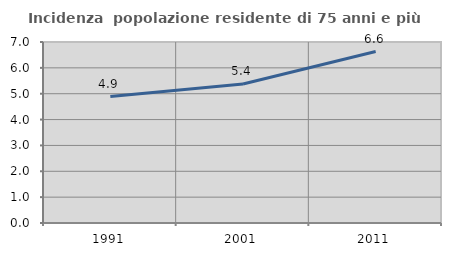
| Category | Incidenza  popolazione residente di 75 anni e più |
|---|---|
| 1991.0 | 4.892 |
| 2001.0 | 5.374 |
| 2011.0 | 6.631 |